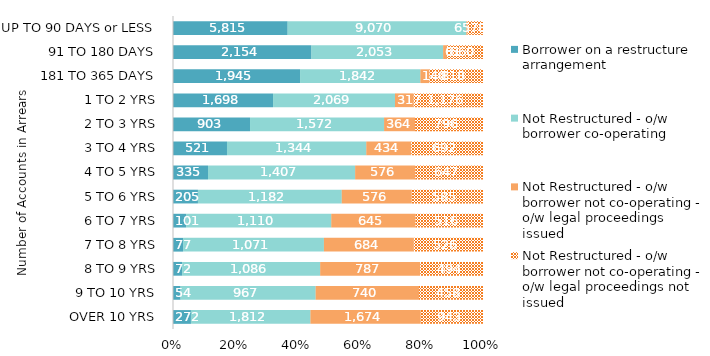
| Category | Borrower on a restructure arrangement | Not Restructured - o/w borrower co-operating | Not Restructured - o/w borrower not co-operating - o/w legal proceedings issued | Not Restructured - o/w borrower not co-operating - o/w legal proceedings not issued |
|---|---|---|---|---|
| OVER 10 YRS | 272 | 1812 | 1674 | 943 |
| 9 TO 10 YRS | 54 | 967 | 740 | 458 |
| 8 TO 9 YRS | 72 | 1086 | 787 | 494 |
| 7 TO 8 YRS | 77 | 1071 | 684 | 526 |
| 6 TO 7 YRS | 101 | 1110 | 645 | 516 |
| 5 TO 6 YRS | 205 | 1182 | 576 | 585 |
| 4 TO 5 YRS | 335 | 1407 | 576 | 647 |
| 3 TO 4 YRS | 521 | 1344 | 434 | 692 |
| 2 TO 3 YRS | 903 | 1572 | 364 | 796 |
| 1 TO 2 YRS | 1698 | 2069 | 317 | 1176 |
| 181 TO 365 DAYS | 1945 | 1842 | 140 | 818 |
| 91 TO 180 DAYS | 2154 | 2053 | 61 | 560 |
| UP TO 90 DAYS or LESS | 5815 | 9070 | 65 | 781 |